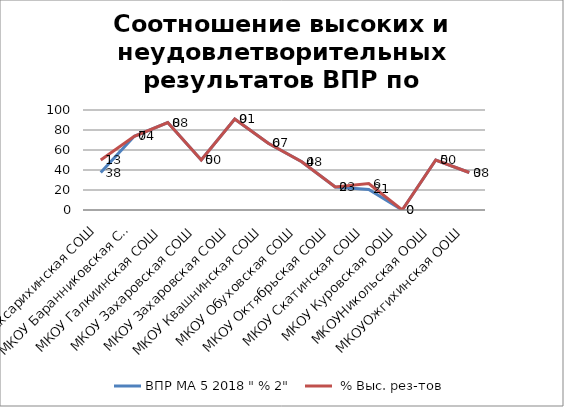
| Category | ВПР МА 5 2018 " % 2" | ВПР МА 5 2018 % Выс. рез-тов |
|---|---|---|
| МКОУ Аксарихинская СОШ | 37.5 | 12.5 |
| МКОУ Баранниковская СОШ | 73.684 | 0 |
| МКОУ Галкиинская СОШ | 87.5 | 0 |
| МКОУ Захаровская СОШ | 50 | 0 |
| МКОУ Захаровская СОШ | 90.909 | 0 |
| МКОУ Квашнинская СОШ | 66.667 | 0 |
| МКОУ Обуховская СОШ | 48.276 | 0 |
| МКОУ Октябрьская СОШ | 23.077 | 0 |
| МКОУ Скатинская СОШ | 20.588 | 5.882 |
| МКОУ Куровская ООШ | 0 | 0 |
| МКОУНикольская ООШ | 50 | 0 |
| МКОУОжгихинская ООШ | 37.5 | 0 |